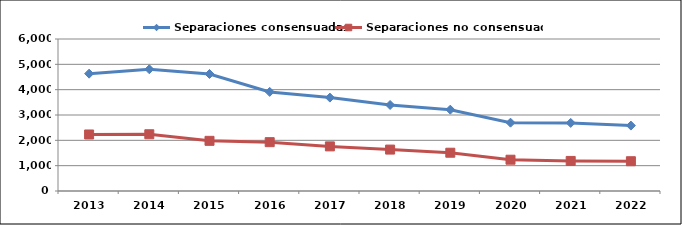
| Category | Separaciones consensuadas | Separaciones no consensuadas |
|---|---|---|
| 2013.0 | 4632 | 2231 |
| 2014.0 | 4805 | 2240 |
| 2015.0 | 4619 | 1980 |
| 2016.0 | 3912 | 1928 |
| 2017.0 | 3687 | 1761 |
| 2018.0 | 3395 | 1635 |
| 2019.0 | 3210 | 1511 |
| 2020.0 | 2697 | 1235 |
| 2021.0 | 2687 | 1187 |
| 2022.0 | 2582 | 1175 |